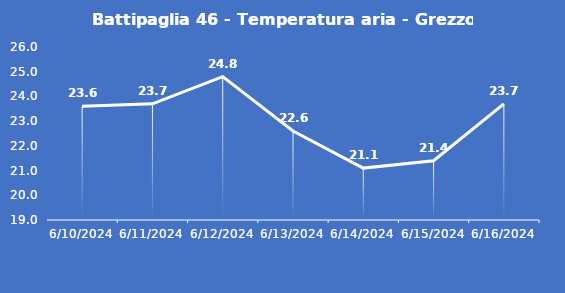
| Category | Battipaglia 46 - Temperatura aria - Grezzo (°C) |
|---|---|
| 6/10/24 | 23.6 |
| 6/11/24 | 23.7 |
| 6/12/24 | 24.8 |
| 6/13/24 | 22.6 |
| 6/14/24 | 21.1 |
| 6/15/24 | 21.4 |
| 6/16/24 | 23.7 |